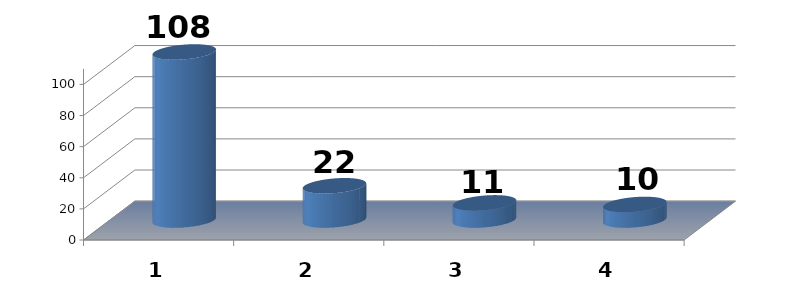
| Category | 1 2 3 4 |
|---|---|
| 0 | 108 |
| 1 | 22 |
| 2 | 11 |
| 3 | 10 |